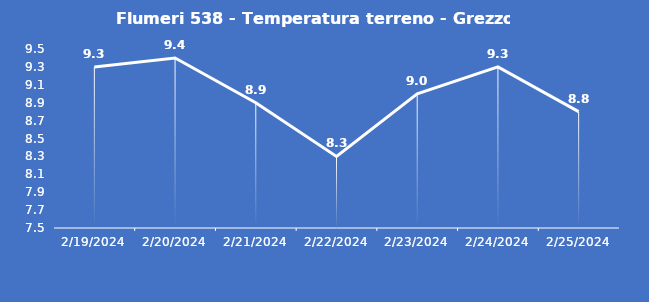
| Category | Flumeri 538 - Temperatura terreno - Grezzo (°C) |
|---|---|
| 2/19/24 | 9.3 |
| 2/20/24 | 9.4 |
| 2/21/24 | 8.9 |
| 2/22/24 | 8.3 |
| 2/23/24 | 9 |
| 2/24/24 | 9.3 |
| 2/25/24 | 8.8 |